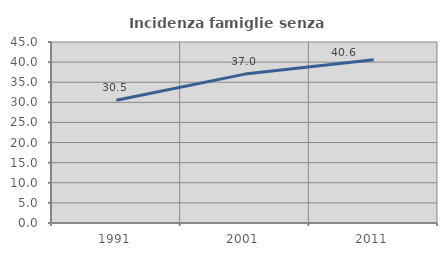
| Category | Incidenza famiglie senza nuclei |
|---|---|
| 1991.0 | 30.527 |
| 2001.0 | 37.02 |
| 2011.0 | 40.576 |